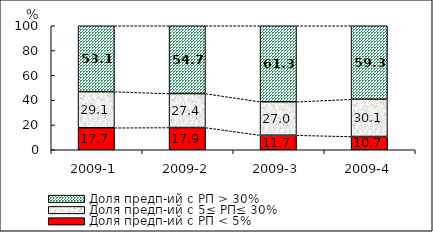
| Category | Доля предп-ий с РП < 5% | Доля предп-ий с 5≤ РП≤ 30% | Доля предп-ий с РП > 30% |
|---|---|---|---|
| 2009-1 | 17.736 | 29.133 | 53.13 |
| 2009-2 | 17.928 | 27.377 | 54.695 |
| 2009-3 | 11.736 | 27.006 | 61.258 |
| 2009-4 | 10.696 | 30.051 | 59.253 |